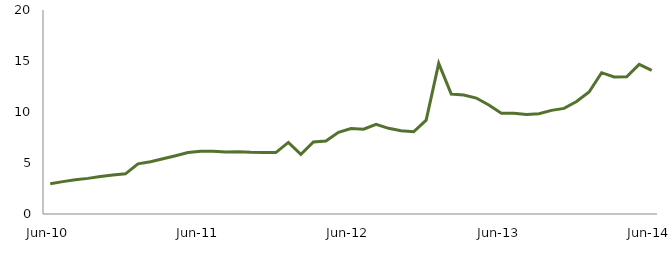
| Category | Series 0 |
|---|---|
| Jun-10 | 2.973 |
|  | 3.176 |
|  | 3.366 |
|  | 3.493 |
|  | 3.666 |
|  | 3.83 |
|  | 3.94 |
|  | 4.916 |
|  | 5.126 |
|  | 5.419 |
|  | 5.714 |
|  | 6.026 |
| Jun-11 | 6.157 |
|  | 6.159 |
|  | 6.071 |
|  | 6.101 |
|  | 6.047 |
|  | 6.024 |
|  | 6.023 |
|  | 7.02 |
|  | 5.854 |
|  | 7.066 |
|  | 7.148 |
|  | 8.003 |
| Jun-12 | 8.373 |
|  | 8.316 |
|  | 8.796 |
|  | 8.398 |
|  | 8.159 |
|  | 8.058 |
|  | 9.197 |
|  | 14.769 |
|  | 11.758 |
|  | 11.668 |
|  | 11.366 |
|  | 10.68 |
| Jun-13 | 9.881 |
|  | 9.866 |
|  | 9.756 |
|  | 9.834 |
|  | 10.159 |
|  | 10.356 |
|  | 11.024 |
|  | 11.964 |
|  | 13.855 |
|  | 13.442 |
|  | 13.452 |
|  | 14.665 |
| Jun-14 | 14.072 |